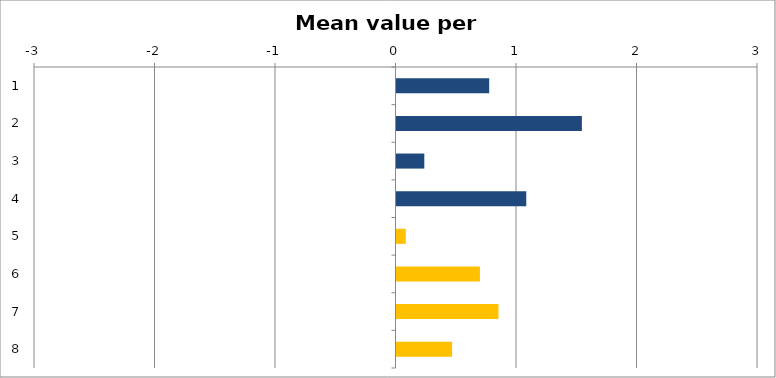
| Category | Mean |
|---|---|
| 0 | 0.769 |
| 1 | 1.538 |
| 2 | 0.231 |
| 3 | 1.077 |
| 4 | 0.077 |
| 5 | 0.692 |
| 6 | 0.846 |
| 7 | 0.462 |